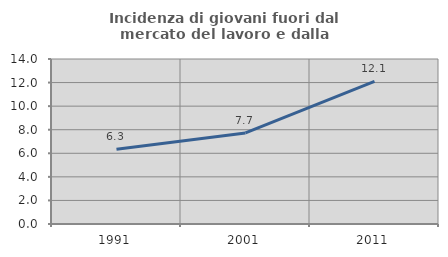
| Category | Incidenza di giovani fuori dal mercato del lavoro e dalla formazione  |
|---|---|
| 1991.0 | 6.347 |
| 2001.0 | 7.727 |
| 2011.0 | 12.098 |